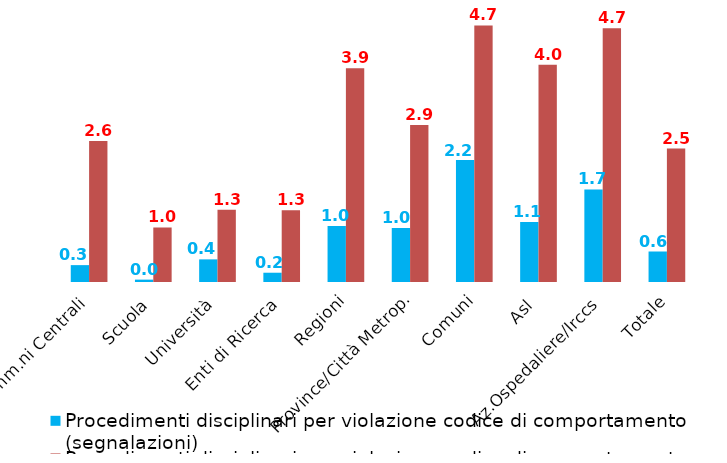
| Category | Procedimenti disciplinari per violazione codice di comportamento (segnalazioni) | Procedimenti disciplinari per violazione codice di comportamento (complessivi) |
|---|---|---|
| Amm.ni Centrali | 0.31 | 2.594 |
| Scuola | 0.044 | 1.004 |
| Università | 0.416 | 1.326 |
| Enti di Ricerca | 0.17 | 1.321 |
| Regioni | 1.028 | 3.931 |
| Province/Città Metrop. | 0.995 | 2.887 |
| Comuni | 2.243 | 4.716 |
| Asl | 1.105 | 3.992 |
| Az.Ospedaliere/Irccs | 1.702 | 4.663 |
| Totale | 0.561 | 2.453 |